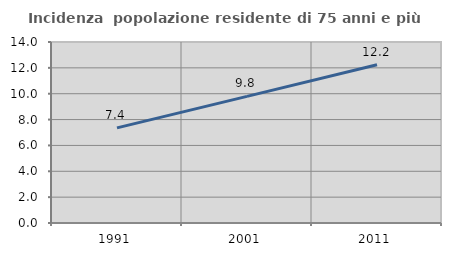
| Category | Incidenza  popolazione residente di 75 anni e più |
|---|---|
| 1991.0 | 7.358 |
| 2001.0 | 9.796 |
| 2011.0 | 12.24 |